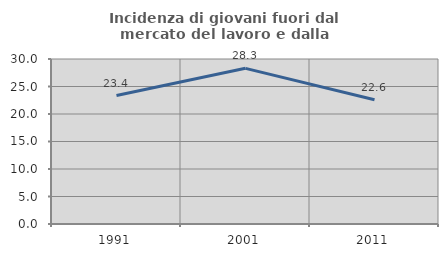
| Category | Incidenza di giovani fuori dal mercato del lavoro e dalla formazione  |
|---|---|
| 1991.0 | 23.36 |
| 2001.0 | 28.302 |
| 2011.0 | 22.596 |